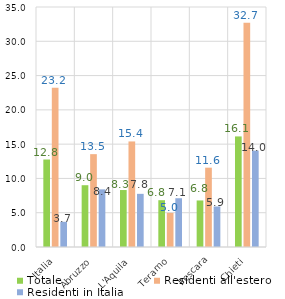
| Category | Totale | Residenti all'estero | Residenti in Italia |
|---|---|---|---|
| Italia | 12.76 | 23.22 | 3.675 |
|   Abruzzo | 9.011 | 13.541 | 8.407 |
|     L'Aquila | 8.308 | 15.393 | 7.753 |
|     Teramo | 6.824 | 4.979 | 7.111 |
|     Pescara | 6.787 | 11.566 | 5.909 |
|     Chieti | 16.125 | 32.721 | 14.049 |